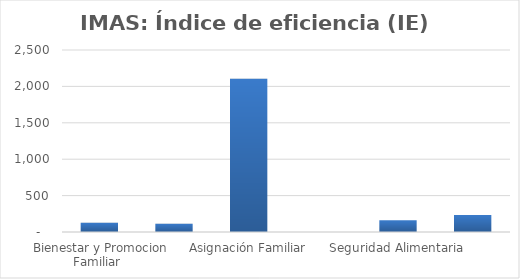
| Category | Índice de eficiencia (IE)  |
|---|---|
| Bienestar y Promocion Familiar | 126.718 |
| Avancemos | 114.617 |
| Asignación Familiar | 2105.239 |
| Prestación Alimentaria | 0 |
| Seguridad Alimentaria | 162.608 |
| Resto de productos | 233.472 |